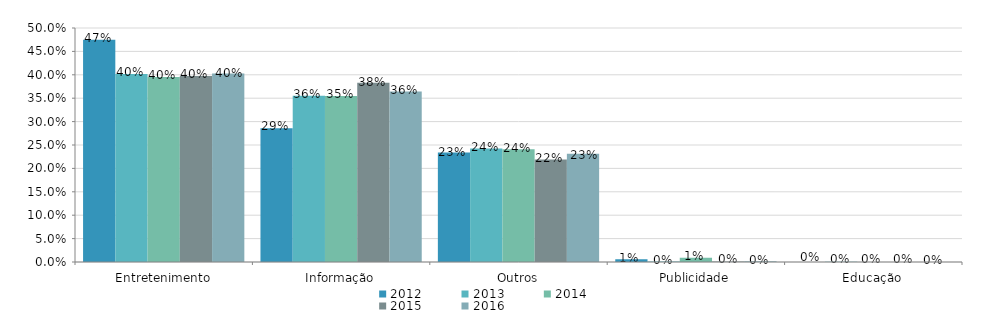
| Category | 2012 | 2013 | 2014 | 2015 | 2016 |
|---|---|---|---|---|---|
| Entretenimento | 0.475 | 0.401 | 0.395 | 0.397 | 0.403 |
| Informação | 0.286 | 0.355 | 0.355 | 0.383 | 0.364 |
| Outros | 0.234 | 0.242 | 0.241 | 0.219 | 0.231 |
| Publicidade | 0.006 | 0.001 | 0.009 | 0.001 | 0.002 |
| Educação | 0 | 0 | 0 | 0 | 0 |